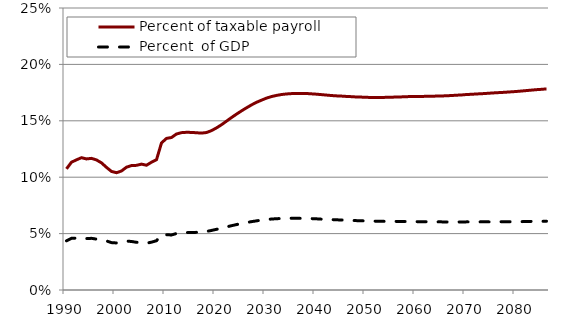
| Category | Percent of taxable payroll | Percent  of GDP |
|---|---|---|
| 1990.0 | 0.107 | 0.044 |
| 1991.0 | 0.113 | 0.046 |
| 1992.0 | 0.115 | 0.046 |
| 1993.0 | 0.117 | 0.046 |
| 1994.0 | 0.116 | 0.046 |
| 1995.0 | 0.117 | 0.046 |
| 1996.0 | 0.115 | 0.045 |
| 1997.0 | 0.113 | 0.044 |
| 1998.0 | 0.109 | 0.044 |
| 1999.0 | 0.105 | 0.042 |
| 2000.0 | 0.104 | 0.042 |
| 2001.0 | 0.106 | 0.043 |
| 2002.0 | 0.109 | 0.043 |
| 2003.0 | 0.11 | 0.043 |
| 2004.0 | 0.11 | 0.042 |
| 2005.0 | 0.112 | 0.042 |
| 2006.0 | 0.111 | 0.042 |
| 2007.0 | 0.113 | 0.042 |
| 2008.0 | 0.116 | 0.044 |
| 2009.0 | 0.13 | 0.049 |
| 2010.0 | 0.134 | 0.049 |
| 2011.0 | 0.135 | 0.049 |
| 2012.0 | 0.138 | 0.05 |
| 2013.0 | 0.139 | 0.051 |
| 2014.0 | 0.14 | 0.051 |
| 2015.0 | 0.14 | 0.051 |
| 2016.0 | 0.139 | 0.051 |
| 2017.0 | 0.139 | 0.051 |
| 2018.0 | 0.14 | 0.052 |
| 2019.0 | 0.141 | 0.053 |
| 2020.0 | 0.144 | 0.054 |
| 2021.0 | 0.146 | 0.055 |
| 2022.0 | 0.15 | 0.056 |
| 2023.0 | 0.153 | 0.057 |
| 2024.0 | 0.156 | 0.058 |
| 2025.0 | 0.159 | 0.059 |
| 2026.0 | 0.161 | 0.06 |
| 2027.0 | 0.164 | 0.061 |
| 2028.0 | 0.166 | 0.061 |
| 2029.0 | 0.168 | 0.062 |
| 2030.0 | 0.17 | 0.062 |
| 2031.0 | 0.172 | 0.063 |
| 2032.0 | 0.172 | 0.063 |
| 2033.0 | 0.173 | 0.063 |
| 2034.0 | 0.174 | 0.064 |
| 2035.0 | 0.174 | 0.064 |
| 2036.0 | 0.174 | 0.064 |
| 2037.0 | 0.174 | 0.064 |
| 2038.0 | 0.174 | 0.063 |
| 2039.0 | 0.174 | 0.063 |
| 2040.0 | 0.174 | 0.063 |
| 2041.0 | 0.173 | 0.063 |
| 2042.0 | 0.173 | 0.063 |
| 2043.0 | 0.172 | 0.062 |
| 2044.0 | 0.172 | 0.062 |
| 2045.0 | 0.172 | 0.062 |
| 2046.0 | 0.172 | 0.062 |
| 2047.0 | 0.171 | 0.062 |
| 2048.0 | 0.171 | 0.062 |
| 2049.0 | 0.171 | 0.061 |
| 2050.0 | 0.171 | 0.061 |
| 2051.0 | 0.171 | 0.061 |
| 2052.0 | 0.171 | 0.061 |
| 2053.0 | 0.171 | 0.061 |
| 2054.0 | 0.171 | 0.061 |
| 2055.0 | 0.171 | 0.061 |
| 2056.0 | 0.171 | 0.061 |
| 2057.0 | 0.171 | 0.061 |
| 2058.0 | 0.171 | 0.061 |
| 2059.0 | 0.172 | 0.061 |
| 2060.0 | 0.172 | 0.061 |
| 2061.0 | 0.172 | 0.061 |
| 2062.0 | 0.172 | 0.06 |
| 2063.0 | 0.172 | 0.06 |
| 2064.0 | 0.172 | 0.06 |
| 2065.0 | 0.172 | 0.06 |
| 2066.0 | 0.172 | 0.06 |
| 2067.0 | 0.172 | 0.06 |
| 2068.0 | 0.173 | 0.06 |
| 2069.0 | 0.173 | 0.06 |
| 2070.0 | 0.173 | 0.06 |
| 2071.0 | 0.174 | 0.06 |
| 2072.0 | 0.174 | 0.06 |
| 2073.0 | 0.174 | 0.06 |
| 2074.0 | 0.174 | 0.06 |
| 2075.0 | 0.175 | 0.06 |
| 2076.0 | 0.175 | 0.06 |
| 2077.0 | 0.175 | 0.06 |
| 2078.0 | 0.175 | 0.06 |
| 2079.0 | 0.176 | 0.06 |
| 2080.0 | 0.176 | 0.061 |
| 2081.0 | 0.176 | 0.061 |
| 2082.0 | 0.177 | 0.061 |
| 2083.0 | 0.177 | 0.061 |
| 2084.0 | 0.178 | 0.061 |
| 2085.0 | 0.178 | 0.061 |
| 2086.0 | 0.178 | 0.061 |